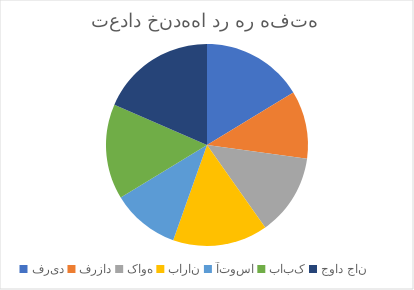
| Category | هفته گذشته | این هفته |
|---|---|---|
| فرید | 15 | 16 |
| فرزاد | 10 | 14 |
| کاوه | 12 | 18 |
| باران | 14 | 14 |
| آتوسا | 10 | 13 |
| بابک | 14 | 15 |
| جواد جان | 17 | 13 |